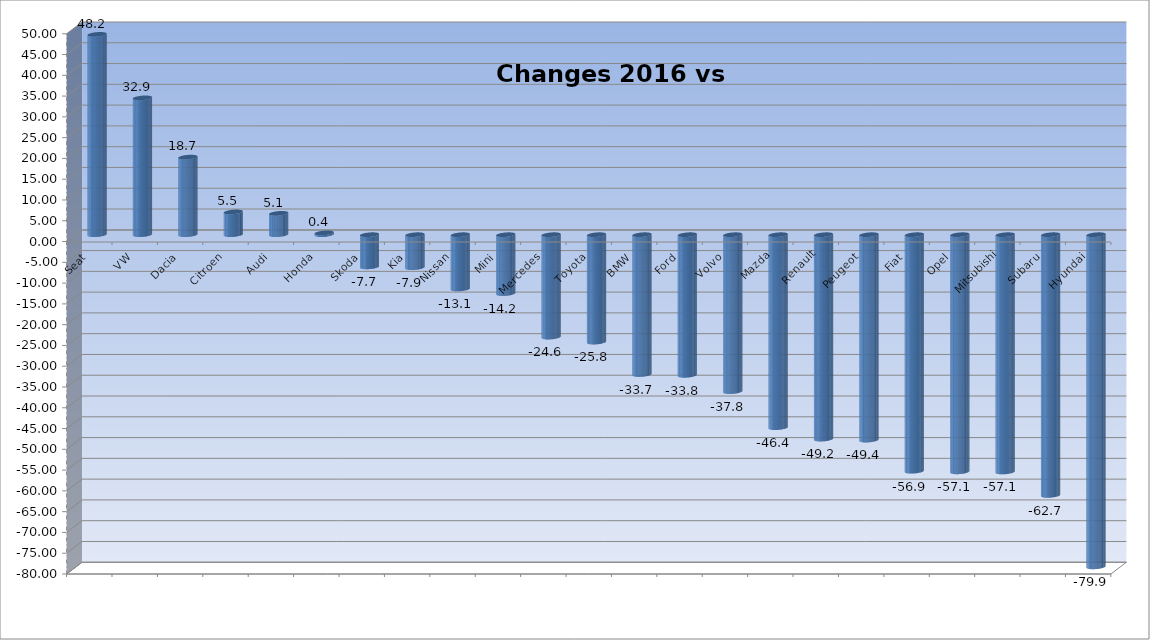
| Category | Ytd 2015 |
|---|---|
| Seat | 48.204 |
| VW | 32.923 |
| Dacia | 18.667 |
| Citroen | 5.476 |
| Audi | 5.137 |
| Honda | 0.431 |
| Skoda | -7.741 |
| Kia | -7.93 |
| Nissan | -13.06 |
| Mini | -14.179 |
| Mercedes | -24.647 |
| Toyota | -25.843 |
| BMW | -33.659 |
| Ford | -33.844 |
| Volvo | -37.763 |
| Mazda | -46.436 |
| Renault | -49.19 |
| Peugeot | -49.431 |
| Fiat | -56.916 |
| Opel | -57.062 |
| Mitsubishi | -57.096 |
| Subaru | -62.74 |
| Hyundai | -79.926 |